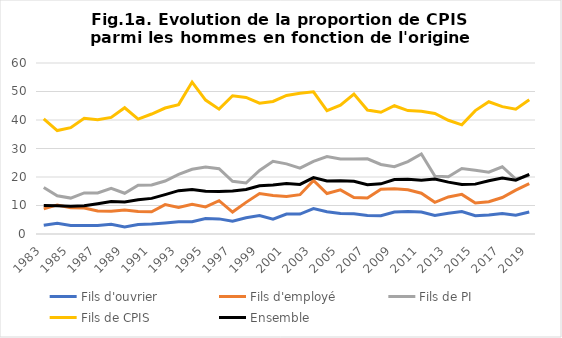
| Category | Fils d'ouvrier | Fils d'employé | Fils de PI | Fils de CPIS | Ensemble |
|---|---|---|---|---|---|
| 1983.0 | 3.1 | 8.8 | 16.3 | 40.4 | 10 |
| 1984.0 | 3.8 | 10.2 | 13.4 | 36.3 | 9.9 |
| 1985.0 | 3 | 9.2 | 12.6 | 37.3 | 9.7 |
| 1986.0 | 3 | 9.1 | 14.4 | 40.6 | 9.9 |
| 1987.0 | 3 | 8.1 | 14.4 | 40.1 | 10.6 |
| 1988.0 | 3.4 | 8 | 16 | 40.9 | 11.4 |
| 1989.0 | 2.5 | 8.4 | 14.3 | 44.3 | 11.2 |
| 1990.0 | 3.3 | 7.9 | 17.1 | 40.3 | 12 |
| 1991.0 | 3.5 | 7.8 | 17.2 | 42.1 | 12.5 |
| 1992.0 | 3.9 | 10.3 | 18.6 | 44.2 | 13.8 |
| 1993.0 | 4.3 | 9.3 | 20.9 | 45.4 | 15.2 |
| 1994.0 | 4.3 | 10.4 | 22.7 | 53.3 | 15.6 |
| 1995.0 | 5.4 | 9.5 | 23.5 | 47 | 15 |
| 1996.0 | 5.3 | 11.7 | 22.9 | 43.8 | 14.9 |
| 1997.0 | 4.5 | 7.7 | 18.5 | 48.5 | 15.1 |
| 1998.0 | 5.7 | 11.1 | 17.9 | 47.9 | 15.6 |
| 1999.0 | 6.5 | 14.2 | 22.3 | 45.9 | 16.9 |
| 2000.0 | 5.2 | 13.5 | 25.5 | 46.5 | 17.2 |
| 2001.0 | 7 | 13.2 | 24.6 | 48.6 | 17.7 |
| 2002.0 | 7 | 13.8 | 23.1 | 49.4 | 17.4 |
| 2003.0 | 8.9 | 18.8 | 25.5 | 49.9 | 19.8 |
| 2004.0 | 7.8 | 14.2 | 27.2 | 43.3 | 18.6 |
| 2005.0 | 7.2 | 15.5 | 26.3 | 45.2 | 18.7 |
| 2006.0 | 7.1 | 12.8 | 26.3 | 49.1 | 18.5 |
| 2007.0 | 6.5 | 12.6 | 26.4 | 43.5 | 17.3 |
| 2008.0 | 6.4 | 15.7 | 24.4 | 42.7 | 17.6 |
| 2009.0 | 7.7 | 15.9 | 23.6 | 45 | 19.1 |
| 2010.0 | 7.9 | 15.5 | 25.4 | 43.3 | 19.2 |
| 2011.0 | 7.7 | 14.3 | 28.1 | 43.1 | 18.9 |
| 2012.0 | 6.5 | 11.1 | 20.3 | 42.3 | 19.3 |
| 2013.0 | 7.3 | 13 | 20.1 | 39.9 | 18.2 |
| 2014.0 | 7.9 | 13.9 | 23 | 38.3 | 17.4 |
| 2015.0 | 6.4 | 10.9 | 22.4 | 43.3 | 17.5 |
| 2016.0 | 6.7 | 11.3 | 21.7 | 46.4 | 18.7 |
| 2017.0 | 7.2 | 12.8 | 23.6 | 44.7 | 19.6 |
| 2018.0 | 6.6 | 15.4 | 19.3 | 43.8 | 18.9 |
| 2019.0 | 7.7 | 17.7 | 20.5 | 47.1 | 20.9 |